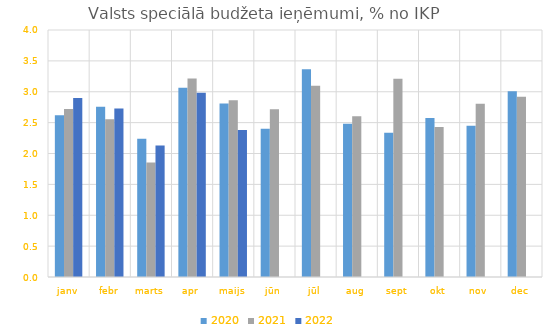
| Category | 2020 | 2021 | 2022 |
|---|---|---|---|
| janv | 2.62 | 2.72 | 2.899 |
| febr | 2.756 | 2.557 | 2.728 |
| marts | 2.241 | 1.855 | 2.132 |
| apr | 3.064 | 3.216 | 2.983 |
| maijs | 2.809 | 2.864 | 2.38 |
| jūn | 2.401 | 2.716 | 0 |
| jūl | 3.366 | 3.098 | 0 |
| aug | 2.481 | 2.603 | 0 |
| sept | 2.336 | 3.21 | 0 |
| okt | 2.575 | 2.428 | 0 |
| nov | 2.45 | 2.804 | 0 |
| dec | 3.008 | 2.921 | 0 |